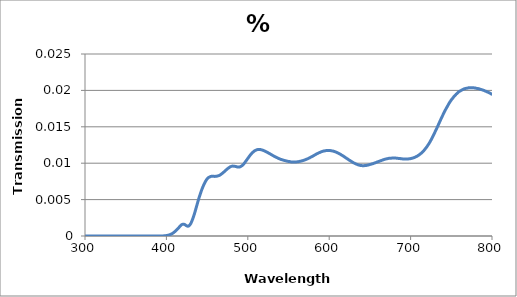
| Category | % Transmission |
|---|---|
| 850.0 | 0.016 |
| 849.0 | 0.016 |
| 848.0 | 0.016 |
| 847.0 | 0.016 |
| 846.0 | 0.016 |
| 845.0 | 0.016 |
| 844.0 | 0.016 |
| 843.0 | 0.016 |
| 842.0 | 0.016 |
| 841.0 | 0.017 |
| 840.0 | 0.017 |
| 839.0 | 0.017 |
| 838.0 | 0.017 |
| 837.0 | 0.017 |
| 836.0 | 0.017 |
| 835.0 | 0.017 |
| 834.0 | 0.017 |
| 833.0 | 0.017 |
| 832.0 | 0.017 |
| 831.0 | 0.017 |
| 830.0 | 0.017 |
| 829.0 | 0.017 |
| 828.0 | 0.018 |
| 827.0 | 0.018 |
| 826.0 | 0.018 |
| 825.0 | 0.018 |
| 824.0 | 0.018 |
| 823.0 | 0.018 |
| 822.0 | 0.018 |
| 821.0 | 0.018 |
| 820.0 | 0.018 |
| 819.0 | 0.018 |
| 818.0 | 0.018 |
| 817.0 | 0.018 |
| 816.0 | 0.018 |
| 815.0 | 0.018 |
| 814.0 | 0.019 |
| 813.0 | 0.019 |
| 812.0 | 0.019 |
| 811.0 | 0.019 |
| 810.0 | 0.019 |
| 809.0 | 0.019 |
| 808.0 | 0.019 |
| 807.0 | 0.019 |
| 806.0 | 0.019 |
| 805.0 | 0.019 |
| 804.0 | 0.019 |
| 803.0 | 0.019 |
| 802.0 | 0.019 |
| 801.0 | 0.019 |
| 800.0 | 0.019 |
| 799.0 | 0.02 |
| 798.0 | 0.02 |
| 797.0 | 0.02 |
| 796.0 | 0.02 |
| 795.0 | 0.02 |
| 794.0 | 0.02 |
| 793.0 | 0.02 |
| 792.0 | 0.02 |
| 791.0 | 0.02 |
| 790.0 | 0.02 |
| 789.0 | 0.02 |
| 788.0 | 0.02 |
| 787.0 | 0.02 |
| 786.0 | 0.02 |
| 785.0 | 0.02 |
| 784.0 | 0.02 |
| 783.0 | 0.02 |
| 782.0 | 0.02 |
| 781.0 | 0.02 |
| 780.0 | 0.02 |
| 779.0 | 0.02 |
| 778.0 | 0.02 |
| 777.0 | 0.02 |
| 776.0 | 0.02 |
| 775.0 | 0.02 |
| 774.0 | 0.02 |
| 773.0 | 0.02 |
| 772.0 | 0.02 |
| 771.0 | 0.02 |
| 770.0 | 0.02 |
| 769.0 | 0.02 |
| 768.0 | 0.02 |
| 767.0 | 0.02 |
| 766.0 | 0.02 |
| 765.0 | 0.02 |
| 764.0 | 0.02 |
| 763.0 | 0.02 |
| 762.0 | 0.02 |
| 761.0 | 0.02 |
| 760.0 | 0.02 |
| 759.0 | 0.02 |
| 758.0 | 0.02 |
| 757.0 | 0.02 |
| 756.0 | 0.019 |
| 755.0 | 0.019 |
| 754.0 | 0.019 |
| 753.0 | 0.019 |
| 752.0 | 0.019 |
| 751.0 | 0.019 |
| 750.0 | 0.019 |
| 749.0 | 0.019 |
| 748.0 | 0.018 |
| 747.0 | 0.018 |
| 746.0 | 0.018 |
| 745.0 | 0.018 |
| 744.0 | 0.018 |
| 743.0 | 0.017 |
| 742.0 | 0.017 |
| 741.0 | 0.017 |
| 740.0 | 0.017 |
| 739.0 | 0.016 |
| 738.0 | 0.016 |
| 737.0 | 0.016 |
| 736.0 | 0.016 |
| 735.0 | 0.016 |
| 734.0 | 0.015 |
| 733.0 | 0.015 |
| 732.0 | 0.015 |
| 731.0 | 0.015 |
| 730.0 | 0.014 |
| 729.0 | 0.014 |
| 728.0 | 0.014 |
| 727.0 | 0.014 |
| 726.0 | 0.013 |
| 725.0 | 0.013 |
| 724.0 | 0.013 |
| 723.0 | 0.013 |
| 722.0 | 0.013 |
| 721.0 | 0.012 |
| 720.0 | 0.012 |
| 719.0 | 0.012 |
| 718.0 | 0.012 |
| 717.0 | 0.012 |
| 716.0 | 0.012 |
| 715.0 | 0.012 |
| 714.0 | 0.011 |
| 713.0 | 0.011 |
| 712.0 | 0.011 |
| 711.0 | 0.011 |
| 710.0 | 0.011 |
| 709.0 | 0.011 |
| 708.0 | 0.011 |
| 707.0 | 0.011 |
| 706.0 | 0.011 |
| 705.0 | 0.011 |
| 704.0 | 0.011 |
| 703.0 | 0.011 |
| 702.0 | 0.011 |
| 701.0 | 0.011 |
| 700.0 | 0.011 |
| 699.0 | 0.011 |
| 698.0 | 0.011 |
| 697.0 | 0.011 |
| 696.0 | 0.011 |
| 695.0 | 0.011 |
| 694.0 | 0.011 |
| 693.0 | 0.011 |
| 692.0 | 0.011 |
| 691.0 | 0.011 |
| 690.0 | 0.011 |
| 689.0 | 0.011 |
| 688.0 | 0.011 |
| 687.0 | 0.011 |
| 686.0 | 0.011 |
| 685.0 | 0.011 |
| 684.0 | 0.011 |
| 683.0 | 0.011 |
| 682.0 | 0.011 |
| 681.0 | 0.011 |
| 680.0 | 0.011 |
| 679.0 | 0.011 |
| 678.0 | 0.011 |
| 677.0 | 0.011 |
| 676.0 | 0.011 |
| 675.0 | 0.011 |
| 674.0 | 0.011 |
| 673.0 | 0.011 |
| 672.0 | 0.011 |
| 671.0 | 0.011 |
| 670.0 | 0.011 |
| 669.0 | 0.011 |
| 668.0 | 0.011 |
| 667.0 | 0.01 |
| 666.0 | 0.01 |
| 665.0 | 0.01 |
| 664.0 | 0.01 |
| 663.0 | 0.01 |
| 662.0 | 0.01 |
| 661.0 | 0.01 |
| 660.0 | 0.01 |
| 659.0 | 0.01 |
| 658.0 | 0.01 |
| 657.0 | 0.01 |
| 656.0 | 0.01 |
| 655.0 | 0.01 |
| 654.0 | 0.01 |
| 653.0 | 0.01 |
| 652.0 | 0.01 |
| 651.0 | 0.01 |
| 650.0 | 0.01 |
| 649.0 | 0.01 |
| 648.0 | 0.01 |
| 647.0 | 0.01 |
| 646.0 | 0.01 |
| 645.0 | 0.01 |
| 644.0 | 0.01 |
| 643.0 | 0.01 |
| 642.0 | 0.01 |
| 641.0 | 0.01 |
| 640.0 | 0.01 |
| 639.0 | 0.01 |
| 638.0 | 0.01 |
| 637.0 | 0.01 |
| 636.0 | 0.01 |
| 635.0 | 0.01 |
| 634.0 | 0.01 |
| 633.0 | 0.01 |
| 632.0 | 0.01 |
| 631.0 | 0.01 |
| 630.0 | 0.01 |
| 629.0 | 0.01 |
| 628.0 | 0.01 |
| 627.0 | 0.01 |
| 626.0 | 0.01 |
| 625.0 | 0.01 |
| 624.0 | 0.01 |
| 623.0 | 0.011 |
| 622.0 | 0.011 |
| 621.0 | 0.011 |
| 620.0 | 0.011 |
| 619.0 | 0.011 |
| 618.0 | 0.011 |
| 617.0 | 0.011 |
| 616.0 | 0.011 |
| 615.0 | 0.011 |
| 614.0 | 0.011 |
| 613.0 | 0.011 |
| 612.0 | 0.011 |
| 611.0 | 0.011 |
| 610.0 | 0.011 |
| 609.0 | 0.011 |
| 608.0 | 0.012 |
| 607.0 | 0.012 |
| 606.0 | 0.012 |
| 605.0 | 0.012 |
| 604.0 | 0.012 |
| 603.0 | 0.012 |
| 602.0 | 0.012 |
| 601.0 | 0.012 |
| 600.0 | 0.012 |
| 599.0 | 0.012 |
| 598.0 | 0.012 |
| 597.0 | 0.012 |
| 596.0 | 0.012 |
| 595.0 | 0.012 |
| 594.0 | 0.012 |
| 593.0 | 0.012 |
| 592.0 | 0.012 |
| 591.0 | 0.012 |
| 590.0 | 0.012 |
| 589.0 | 0.012 |
| 588.0 | 0.011 |
| 587.0 | 0.011 |
| 586.0 | 0.011 |
| 585.0 | 0.011 |
| 584.0 | 0.011 |
| 583.0 | 0.011 |
| 582.0 | 0.011 |
| 581.0 | 0.011 |
| 580.0 | 0.011 |
| 579.0 | 0.011 |
| 578.0 | 0.011 |
| 577.0 | 0.011 |
| 576.0 | 0.011 |
| 575.0 | 0.011 |
| 574.0 | 0.011 |
| 573.0 | 0.011 |
| 572.0 | 0.011 |
| 571.0 | 0.01 |
| 570.0 | 0.01 |
| 569.0 | 0.01 |
| 568.0 | 0.01 |
| 567.0 | 0.01 |
| 566.0 | 0.01 |
| 565.0 | 0.01 |
| 564.0 | 0.01 |
| 563.0 | 0.01 |
| 562.0 | 0.01 |
| 561.0 | 0.01 |
| 560.0 | 0.01 |
| 559.0 | 0.01 |
| 558.0 | 0.01 |
| 557.0 | 0.01 |
| 556.0 | 0.01 |
| 555.0 | 0.01 |
| 554.0 | 0.01 |
| 553.0 | 0.01 |
| 552.0 | 0.01 |
| 551.0 | 0.01 |
| 550.0 | 0.01 |
| 549.0 | 0.01 |
| 548.0 | 0.01 |
| 547.0 | 0.01 |
| 546.0 | 0.01 |
| 545.0 | 0.01 |
| 544.0 | 0.01 |
| 543.0 | 0.01 |
| 542.0 | 0.01 |
| 541.0 | 0.011 |
| 540.0 | 0.011 |
| 539.0 | 0.011 |
| 538.0 | 0.011 |
| 537.0 | 0.011 |
| 536.0 | 0.011 |
| 535.0 | 0.011 |
| 534.0 | 0.011 |
| 533.0 | 0.011 |
| 532.0 | 0.011 |
| 531.0 | 0.011 |
| 530.0 | 0.011 |
| 529.0 | 0.011 |
| 528.0 | 0.011 |
| 527.0 | 0.011 |
| 526.0 | 0.011 |
| 525.0 | 0.011 |
| 524.0 | 0.011 |
| 523.0 | 0.012 |
| 522.0 | 0.012 |
| 521.0 | 0.012 |
| 520.0 | 0.012 |
| 519.0 | 0.012 |
| 518.0 | 0.012 |
| 517.0 | 0.012 |
| 516.0 | 0.012 |
| 515.0 | 0.012 |
| 514.0 | 0.012 |
| 513.0 | 0.012 |
| 512.0 | 0.012 |
| 511.0 | 0.012 |
| 510.0 | 0.012 |
| 509.0 | 0.012 |
| 508.0 | 0.012 |
| 507.0 | 0.012 |
| 506.0 | 0.011 |
| 505.0 | 0.011 |
| 504.0 | 0.011 |
| 503.0 | 0.011 |
| 502.0 | 0.011 |
| 501.0 | 0.011 |
| 500.0 | 0.011 |
| 499.0 | 0.01 |
| 498.0 | 0.01 |
| 497.0 | 0.01 |
| 496.0 | 0.01 |
| 495.0 | 0.01 |
| 494.0 | 0.01 |
| 493.0 | 0.01 |
| 492.0 | 0.01 |
| 491.0 | 0.01 |
| 490.0 | 0.009 |
| 489.0 | 0.009 |
| 488.0 | 0.009 |
| 487.0 | 0.009 |
| 486.0 | 0.01 |
| 485.0 | 0.01 |
| 484.0 | 0.01 |
| 483.0 | 0.01 |
| 482.0 | 0.01 |
| 481.0 | 0.01 |
| 480.0 | 0.01 |
| 479.0 | 0.01 |
| 478.0 | 0.009 |
| 477.0 | 0.009 |
| 476.0 | 0.009 |
| 475.0 | 0.009 |
| 474.0 | 0.009 |
| 473.0 | 0.009 |
| 472.0 | 0.009 |
| 471.0 | 0.009 |
| 470.0 | 0.009 |
| 469.0 | 0.009 |
| 468.0 | 0.009 |
| 467.0 | 0.008 |
| 466.0 | 0.008 |
| 465.0 | 0.008 |
| 464.0 | 0.008 |
| 463.0 | 0.008 |
| 462.0 | 0.008 |
| 461.0 | 0.008 |
| 460.0 | 0.008 |
| 459.0 | 0.008 |
| 458.0 | 0.008 |
| 457.0 | 0.008 |
| 456.0 | 0.008 |
| 455.0 | 0.008 |
| 454.0 | 0.008 |
| 453.0 | 0.008 |
| 452.0 | 0.008 |
| 451.0 | 0.008 |
| 450.0 | 0.008 |
| 449.0 | 0.008 |
| 448.0 | 0.007 |
| 447.0 | 0.007 |
| 446.0 | 0.007 |
| 445.0 | 0.007 |
| 444.0 | 0.007 |
| 443.0 | 0.006 |
| 442.0 | 0.006 |
| 441.0 | 0.006 |
| 440.0 | 0.005 |
| 439.0 | 0.005 |
| 438.0 | 0.004 |
| 437.0 | 0.004 |
| 436.0 | 0.004 |
| 435.0 | 0.003 |
| 434.0 | 0.003 |
| 433.0 | 0.003 |
| 432.0 | 0.002 |
| 431.0 | 0.002 |
| 430.0 | 0.002 |
| 429.0 | 0.002 |
| 428.0 | 0.001 |
| 427.0 | 0.001 |
| 426.0 | 0.001 |
| 425.0 | 0.001 |
| 424.0 | 0.001 |
| 423.0 | 0.002 |
| 422.0 | 0.002 |
| 421.0 | 0.002 |
| 420.0 | 0.002 |
| 419.0 | 0.002 |
| 418.0 | 0.001 |
| 417.0 | 0.001 |
| 416.0 | 0.001 |
| 415.0 | 0.001 |
| 414.0 | 0.001 |
| 413.0 | 0.001 |
| 412.0 | 0.001 |
| 411.0 | 0.001 |
| 410.0 | 0.001 |
| 409.0 | 0 |
| 408.0 | 0 |
| 407.0 | 0 |
| 406.0 | 0 |
| 405.0 | 0 |
| 404.0 | 0 |
| 403.0 | 0 |
| 402.0 | 0 |
| 401.0 | 0 |
| 400.0 | 0 |
| 399.0 | 0 |
| 398.0 | 0 |
| 397.0 | 0 |
| 396.0 | 0 |
| 395.0 | 0 |
| 394.0 | 0 |
| 393.0 | 0 |
| 392.0 | 0 |
| 391.0 | 0 |
| 390.0 | 0 |
| 389.0 | 0 |
| 388.0 | 0 |
| 387.0 | 0 |
| 386.0 | 0 |
| 385.0 | 0 |
| 384.0 | 0 |
| 383.0 | 0 |
| 382.0 | 0 |
| 381.0 | 0 |
| 380.0 | 0 |
| 379.0 | 0 |
| 378.0 | 0 |
| 377.0 | 0 |
| 376.0 | 0 |
| 375.0 | 0 |
| 374.0 | 0 |
| 373.0 | 0 |
| 372.0 | 0 |
| 371.0 | 0 |
| 370.0 | 0 |
| 369.0 | 0 |
| 368.0 | 0 |
| 367.0 | 0 |
| 366.0 | 0 |
| 365.0 | 0 |
| 364.0 | 0 |
| 363.0 | 0 |
| 362.0 | 0 |
| 361.0 | 0 |
| 360.0 | 0 |
| 359.0 | 0 |
| 358.0 | 0 |
| 357.0 | 0 |
| 356.0 | 0 |
| 355.0 | 0 |
| 354.0 | 0 |
| 353.0 | 0 |
| 352.0 | 0 |
| 351.0 | 0 |
| 350.0 | 0 |
| 349.0 | 0 |
| 348.0 | 0 |
| 347.0 | 0 |
| 346.0 | 0 |
| 345.0 | 0 |
| 344.0 | 0 |
| 343.0 | 0 |
| 342.0 | 0 |
| 341.0 | 0 |
| 340.0 | 0 |
| 339.0 | 0 |
| 338.0 | 0 |
| 337.0 | 0 |
| 336.0 | 0 |
| 335.0 | 0 |
| 334.0 | 0 |
| 333.0 | 0 |
| 332.0 | 0 |
| 331.0 | 0 |
| 330.0 | 0 |
| 329.0 | 0 |
| 328.0 | 0 |
| 327.0 | 0 |
| 326.0 | 0 |
| 325.0 | 0 |
| 324.0 | 0 |
| 323.0 | 0 |
| 322.0 | 0 |
| 321.0 | 0 |
| 320.0 | 0 |
| 319.0 | 0 |
| 318.0 | 0 |
| 317.0 | 0 |
| 316.0 | 0 |
| 315.0 | 0 |
| 314.0 | 0 |
| 313.0 | 0 |
| 312.0 | 0 |
| 311.0 | 0 |
| 310.0 | 0 |
| 309.0 | 0 |
| 308.0 | 0 |
| 307.0 | 0 |
| 306.0 | 0 |
| 305.0 | 0 |
| 304.0 | 0 |
| 303.0 | 0 |
| 302.0 | 0 |
| 301.0 | 0 |
| 300.0 | 0 |
| 299.0 | 0 |
| 298.0 | 0 |
| 297.0 | 0 |
| 296.0 | 0 |
| 295.0 | 0 |
| 294.0 | 0 |
| 293.0 | 0 |
| 292.0 | 0 |
| 291.0 | 0 |
| 290.0 | 0 |
| 289.0 | 0 |
| 288.0 | 0 |
| 287.0 | 0 |
| 286.0 | 0 |
| 285.0 | 0 |
| 284.0 | 0 |
| 283.0 | 0 |
| 282.0 | 0 |
| 281.0 | 0 |
| 280.0 | 0 |
| 279.0 | 0 |
| 278.0 | 0 |
| 277.0 | 0 |
| 276.0 | 0 |
| 275.0 | 0 |
| 274.0 | 0 |
| 273.0 | 0 |
| 272.0 | 0 |
| 271.0 | 0 |
| 270.0 | 0 |
| 269.0 | 0 |
| 268.0 | 0 |
| 267.0 | 0 |
| 266.0 | 0 |
| 265.0 | 0 |
| 264.0 | 0 |
| 263.0 | 0 |
| 262.0 | 0 |
| 261.0 | 0 |
| 260.0 | 0 |
| 259.0 | 0 |
| 258.0 | 0 |
| 257.0 | 0 |
| 256.0 | 0 |
| 255.0 | 0 |
| 254.0 | 0 |
| 253.0 | 0 |
| 252.0 | 0 |
| 251.0 | 0 |
| 250.0 | 0 |
| 249.0 | 0 |
| 248.0 | 0 |
| 247.0 | 0 |
| 246.0 | 0 |
| 245.0 | 0 |
| 244.0 | 0 |
| 243.0 | 0 |
| 242.0 | 0 |
| 241.0 | 0 |
| 240.0 | 0 |
| 239.0 | 0 |
| 238.0 | 0 |
| 237.0 | 0 |
| 236.0 | 0 |
| 235.0 | 0 |
| 234.0 | 0 |
| 233.0 | 0 |
| 232.0 | 0 |
| 231.0 | 0 |
| 230.0 | 0 |
| 229.0 | 0 |
| 228.0 | 0 |
| 227.0 | 0 |
| 226.0 | 0 |
| 225.0 | 0 |
| 224.0 | 0 |
| 223.0 | 0 |
| 222.0 | 0 |
| 221.0 | 0 |
| 220.0 | 0 |
| 219.0 | 0 |
| 218.0 | 0 |
| 217.0 | 0 |
| 216.0 | 0 |
| 215.0 | 0 |
| 214.0 | 0 |
| 213.0 | 0 |
| 212.0 | 0 |
| 211.0 | 0 |
| 210.0 | 0 |
| 209.0 | 0 |
| 208.0 | 0 |
| 207.0 | 0 |
| 206.0 | 0 |
| 205.0 | 0 |
| 204.0 | 0 |
| 203.0 | 0 |
| 202.0 | 0 |
| 201.0 | 0 |
| 200.0 | 0 |